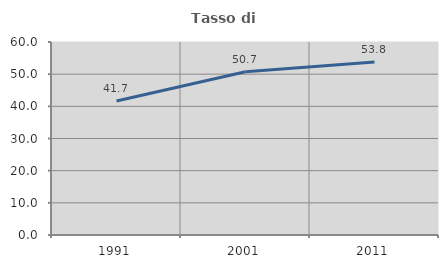
| Category | Tasso di occupazione   |
|---|---|
| 1991.0 | 41.652 |
| 2001.0 | 50.725 |
| 2011.0 | 53.787 |